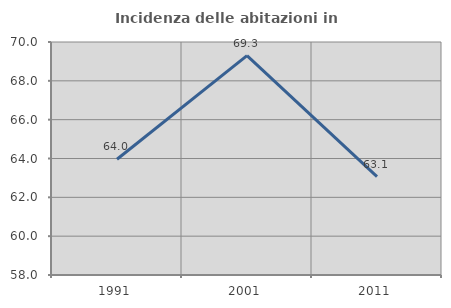
| Category | Incidenza delle abitazioni in proprietà  |
|---|---|
| 1991.0 | 63.96 |
| 2001.0 | 69.3 |
| 2011.0 | 63.065 |